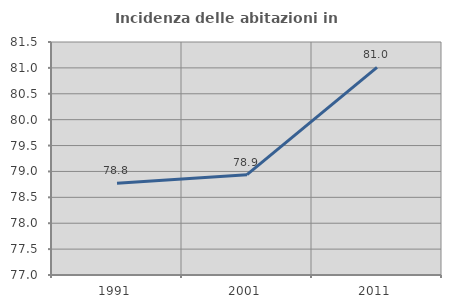
| Category | Incidenza delle abitazioni in proprietà  |
|---|---|
| 1991.0 | 78.772 |
| 2001.0 | 78.937 |
| 2011.0 | 81.01 |